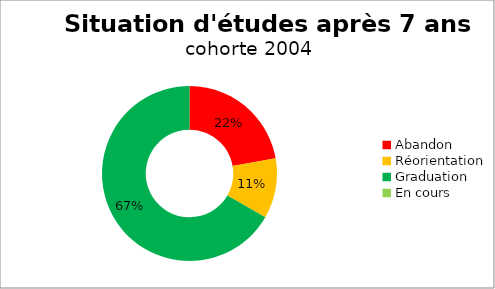
| Category | Series 0 |
|---|---|
| Abandon | 0.222 |
| Réorientation | 0.111 |
| Graduation | 0.667 |
| En cours | 0 |